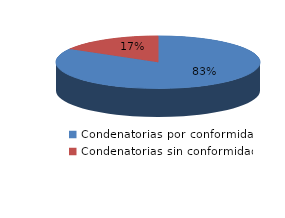
| Category | Series 0 |
|---|---|
| 0 | 30 |
| 1 | 6 |